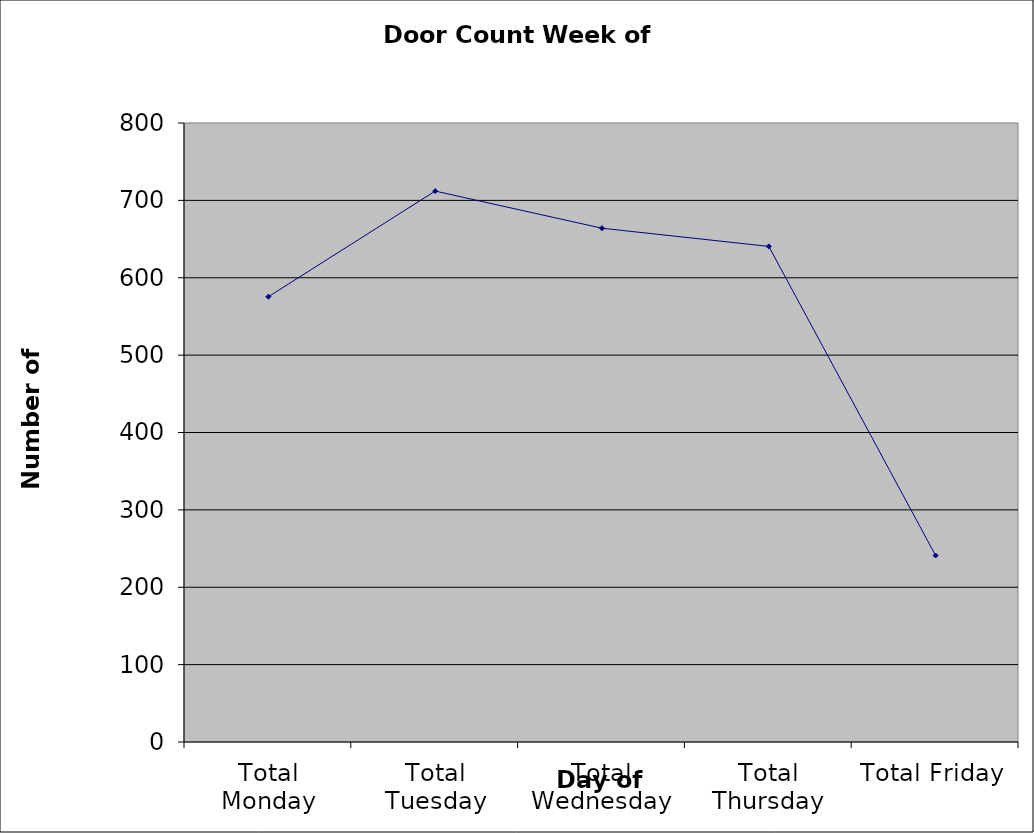
| Category | Series 0 |
|---|---|
| Total Monday | 575.5 |
| Total Tuesday | 712 |
| Total Wednesday | 664 |
| Total Thursday | 640.5 |
| Total Friday | 241 |